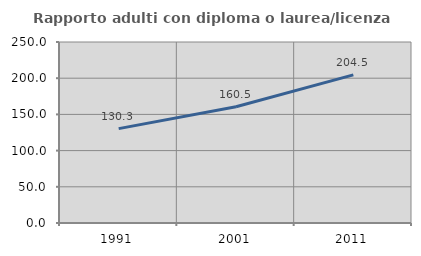
| Category | Rapporto adulti con diploma o laurea/licenza media  |
|---|---|
| 1991.0 | 130.348 |
| 2001.0 | 160.514 |
| 2011.0 | 204.532 |